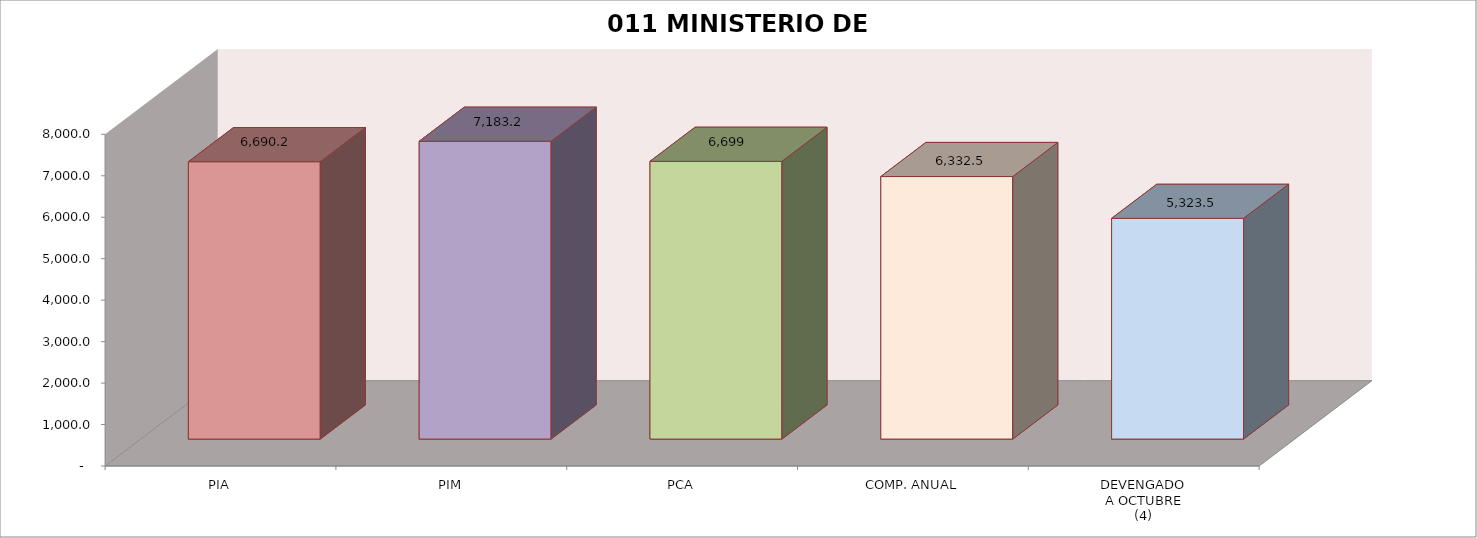
| Category | 011 MINISTERIO DE SALUD |
|---|---|
| PIA | 6690.187 |
| PIM | 7183.22 |
| PCA | 6699.309 |
| COMP. ANUAL | 6332.452 |
| DEVENGADO
A OCTUBRE
(4) | 5323.464 |